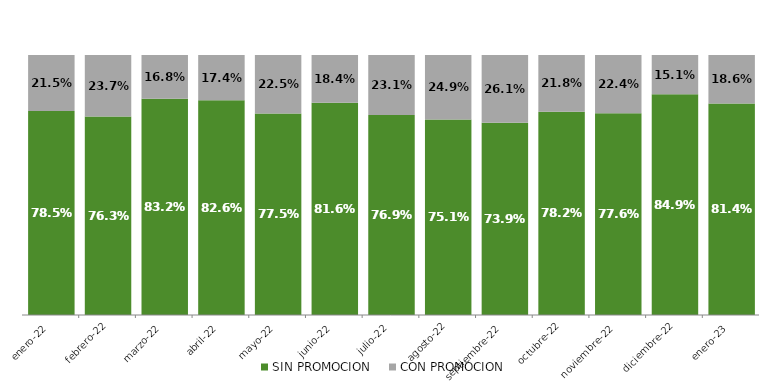
| Category | SIN PROMOCION   | CON PROMOCION   |
|---|---|---|
| 2022-01-01 | 0.785 | 0.215 |
| 2022-02-01 | 0.763 | 0.237 |
| 2022-03-01 | 0.832 | 0.168 |
| 2022-04-01 | 0.826 | 0.174 |
| 2022-05-01 | 0.775 | 0.225 |
| 2022-06-01 | 0.816 | 0.184 |
| 2022-07-01 | 0.769 | 0.231 |
| 2022-08-01 | 0.751 | 0.249 |
| 2022-09-01 | 0.739 | 0.261 |
| 2022-10-01 | 0.782 | 0.218 |
| 2022-11-01 | 0.776 | 0.224 |
| 2022-12-01 | 0.849 | 0.151 |
| 2023-01-01 | 0.814 | 0.186 |